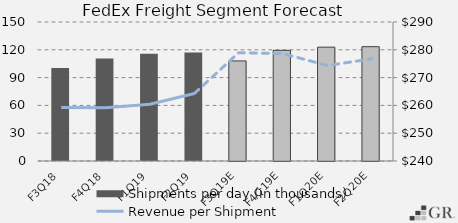
| Category | Shipments per day (in thousands) |
|---|---|
|  F3Q18  | 100.34 |
|  F4Q18  | 110.56 |
|  F1Q19  | 115.745 |
|  F2Q19  | 117.05 |
|  F3Q19E  | 108.012 |
|  F4Q19E  | 119.445 |
|  F1Q20E  | 122.845 |
|  F2Q20E  | 123.359 |